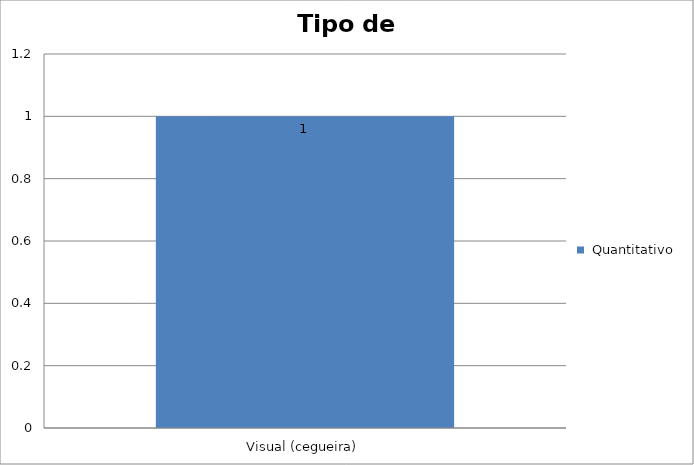
| Category |  Quantitativo |
|---|---|
| Visual (cegueira) | 1 |